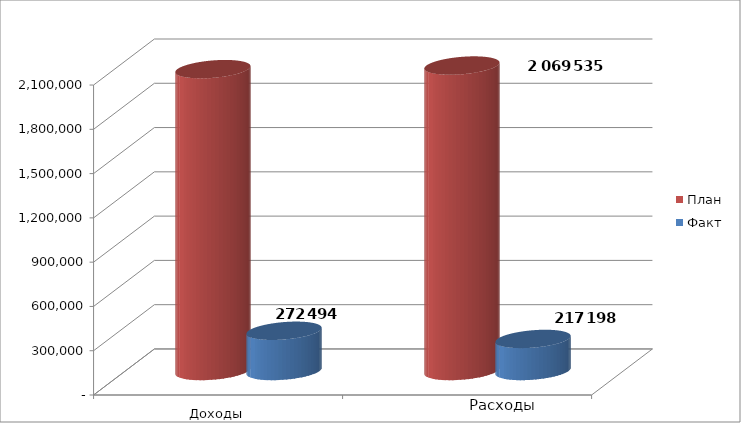
| Category | План | Факт |
|---|---|---|
| 0 | 2045130 | 272494 |
| 1 | 2069535 | 217198 |